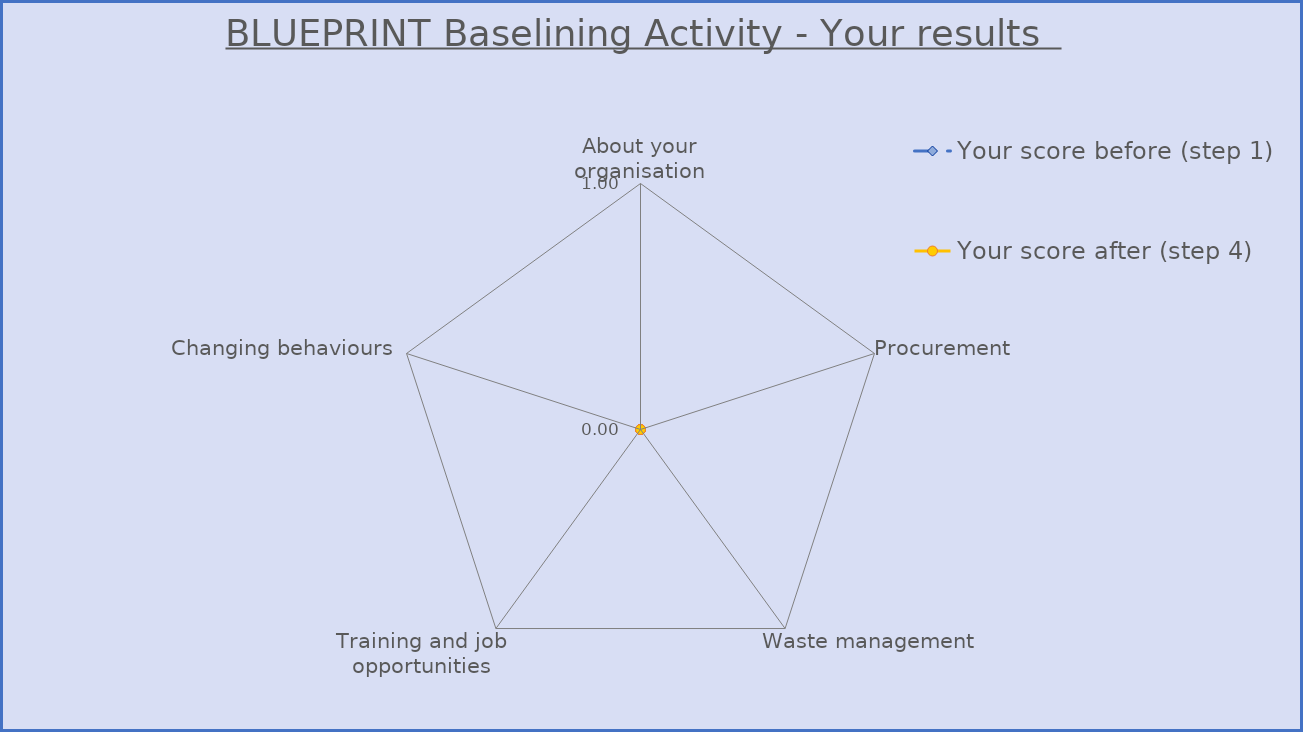
| Category | Your score before (step 1) | Your score after (step 4) |
|---|---|---|
| About your organisation | 0 | 0 |
| Procurement | 0 | 0 |
| Waste management | 0 | 0 |
| Training and job opportunities | 0 | 0 |
| Changing behaviours | 0 | 0 |